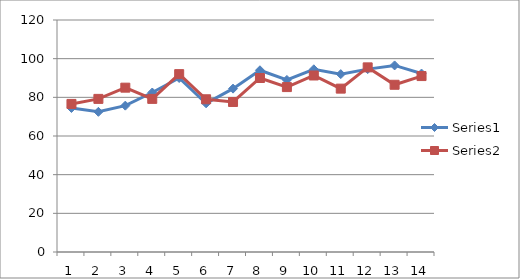
| Category | Series 0 | Series 1 |
|---|---|---|
| 0 | 74.5 | 76.6 |
| 1 | 72.5 | 79.2 |
| 2 | 75.7 | 85 |
| 3 | 82.5 | 79.2 |
| 4 | 90 | 92 |
| 5 | 76.9 | 79 |
| 6 | 84.5 | 77.6 |
| 7 | 94 | 90 |
| 8 | 89 | 85.3 |
| 9 | 94.5 | 91.3 |
| 10 | 92 | 84.5 |
| 11 | 94.6 | 95.5 |
| 12 | 96.5 | 86.5 |
| 13 | 92.3 | 91 |